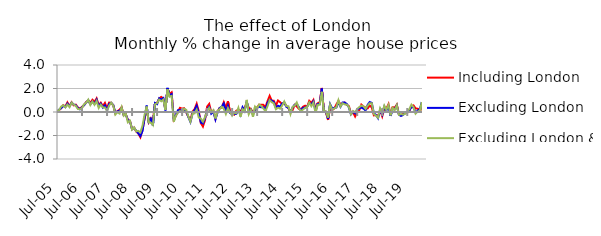
| Category | Including London | Excluding London | Excluding London & SE |
|---|---|---|---|
| 2005-07-01 | 0.014 | -0.006 | 0.09 |
| 2005-08-01 | 0.163 | 0.204 | 0.162 |
| 2005-09-01 | 0.324 | 0.325 | 0.462 |
| 2005-10-01 | 0.577 | 0.533 | 0.574 |
| 2005-11-01 | 0.466 | 0.417 | 0.391 |
| 2005-12-01 | 0.812 | 0.711 | 0.637 |
| 2006-01-01 | 0.5 | 0.49 | 0.413 |
| 2006-02-01 | 0.828 | 0.794 | 0.795 |
| 2006-03-01 | 0.563 | 0.637 | 0.633 |
| 2006-04-01 | 0.621 | 0.57 | 0.521 |
| 2006-05-01 | 0.386 | 0.352 | 0.256 |
| 2006-06-01 | 0.291 | 0.226 | 0.232 |
| 2006-07-01 | 0.438 | 0.412 | 0.342 |
| 2006-08-01 | 0.591 | 0.577 | 0.661 |
| 2006-09-01 | 0.848 | 0.81 | 0.786 |
| 2006-10-01 | 0.979 | 1.005 | 1.049 |
| 2006-11-01 | 0.775 | 0.651 | 0.593 |
| 2006-12-01 | 1.037 | 0.905 | 0.892 |
| 2007-01-01 | 0.858 | 0.697 | 0.609 |
| 2007-02-01 | 1.157 | 1.043 | 0.936 |
| 2007-03-01 | 0.591 | 0.493 | 0.34 |
| 2007-04-01 | 0.791 | 0.71 | 0.625 |
| 2007-05-01 | 0.495 | 0.385 | 0.394 |
| 2007-06-01 | 0.773 | 0.572 | 0.376 |
| 2007-07-01 | 0.314 | 0.122 | 0.088 |
| 2007-08-01 | 0.802 | 0.688 | 0.543 |
| 2007-09-01 | 0.779 | 0.781 | 0.791 |
| 2007-10-01 | 0.566 | 0.59 | 0.551 |
| 2007-11-01 | -0.121 | -0.088 | -0.213 |
| 2007-12-01 | 0.07 | 0.05 | -0.02 |
| 2008-01-01 | 0.193 | 0.09 | -0.129 |
| 2008-02-01 | 0.407 | 0.326 | 0.403 |
| 2008-03-01 | -0.27 | -0.262 | -0.309 |
| 2008-04-01 | -0.198 | -0.21 | -0.151 |
| 2008-05-01 | -0.666 | -0.685 | -0.88 |
| 2008-06-01 | -0.763 | -0.783 | -0.746 |
| 2008-07-01 | -1.456 | -1.471 | -1.501 |
| 2008-08-01 | -1.333 | -1.353 | -1.313 |
| 2008-09-01 | -1.666 | -1.602 | -1.648 |
| 2008-10-01 | -1.827 | -1.811 | -1.607 |
| 2008-11-01 | -2.152 | -2.056 | -1.731 |
| 2008-12-01 | -1.511 | -1.621 | -1.176 |
| 2009-01-01 | -0.593 | -0.517 | -0.245 |
| 2009-02-01 | 0.356 | 0.548 | 0.469 |
| 2009-03-01 | -0.862 | -0.838 | -0.892 |
| 2009-04-01 | -0.536 | -0.573 | -0.91 |
| 2009-05-01 | -0.786 | -1.169 | -1.113 |
| 2009-06-01 | 0.762 | 0.765 | 0.654 |
| 2009-07-01 | 0.77 | 0.668 | 0.757 |
| 2009-08-01 | 1.139 | 1.168 | 1.057 |
| 2009-09-01 | 1.284 | 1.066 | 0.915 |
| 2009-10-01 | 1.145 | 1.185 | 1.057 |
| 2009-11-01 | 0.204 | 0.132 | 0.175 |
| 2009-12-01 | 1.994 | 2.051 | 1.926 |
| 2010-01-01 | 1.536 | 1.399 | 1.297 |
| 2010-02-01 | 1.676 | 1.521 | 1.369 |
| 2010-03-01 | -0.651 | -0.718 | -0.827 |
| 2010-04-01 | -0.343 | -0.254 | -0.294 |
| 2010-05-01 | 0.049 | 0.144 | -0.074 |
| 2010-06-01 | 0.354 | 0.167 | 0.091 |
| 2010-07-01 | 0.283 | 0.116 | -0.045 |
| 2010-08-01 | 0.323 | 0.246 | 0.282 |
| 2010-09-01 | -0.047 | 0.051 | 0.181 |
| 2010-10-01 | -0.391 | -0.428 | -0.388 |
| 2010-11-01 | -0.701 | -0.847 | -0.825 |
| 2010-12-01 | 0.034 | -0.13 | -0.156 |
| 2011-01-01 | 0.244 | 0.162 | -0.115 |
| 2011-02-01 | 0.703 | 0.521 | 0.199 |
| 2011-03-01 | 0.059 | -0.093 | -0.469 |
| 2011-04-01 | -0.947 | -0.896 | -0.555 |
| 2011-05-01 | -1.241 | -0.98 | -0.829 |
| 2011-06-01 | -0.69 | -0.549 | -0.431 |
| 2011-07-01 | 0.458 | 0.212 | 0.054 |
| 2011-08-01 | 0.687 | 0.448 | 0.361 |
| 2011-09-01 | -0.023 | -0.142 | -0.013 |
| 2011-10-01 | 0.118 | 0.024 | 0.154 |
| 2011-11-01 | -0.58 | -0.635 | -0.549 |
| 2011-12-01 | 0.04 | -0.052 | 0.097 |
| 2012-01-01 | 0.333 | 0.333 | 0.235 |
| 2012-02-01 | 0.371 | 0.455 | 0.454 |
| 2012-03-01 | 0.836 | 0.719 | 0.266 |
| 2012-04-01 | 0.354 | 0.041 | -0.17 |
| 2012-05-01 | 0.924 | 0.531 | 0.33 |
| 2012-06-01 | -0.009 | -0.088 | -0.008 |
| 2012-07-01 | -0.101 | -0.157 | -0.313 |
| 2012-08-01 | -0.222 | -0.149 | -0.056 |
| 2012-09-01 | 0.107 | -0.167 | -0.111 |
| 2012-10-01 | 0.182 | 0.18 | 0.355 |
| 2012-11-01 | 0.049 | -0.244 | -0.405 |
| 2012-12-01 | 0.313 | 0.4 | 0.24 |
| 2013-01-01 | 0.306 | 0.087 | 0.068 |
| 2013-02-01 | 0.812 | 0.894 | 1.028 |
| 2013-03-01 | 0.345 | 0.054 | -0.185 |
| 2013-04-01 | 0.271 | 0.195 | 0.178 |
| 2013-05-01 | -0.069 | -0.184 | -0.413 |
| 2013-06-01 | 0.154 | 0.189 | 0.469 |
| 2013-07-01 | 0.387 | 0.362 | 0.318 |
| 2013-08-01 | 0.627 | 0.449 | 0.637 |
| 2013-09-01 | 0.614 | 0.397 | 0.507 |
| 2013-10-01 | 0.608 | 0.414 | 0.301 |
| 2013-11-01 | 0.433 | 0.181 | 0.067 |
| 2013-12-01 | 0.932 | 0.793 | 0.508 |
| 2014-01-01 | 1.371 | 1.039 | 1.01 |
| 2014-02-01 | 0.968 | 0.974 | 0.843 |
| 2014-03-01 | 0.953 | 0.835 | 0.729 |
| 2014-04-01 | 0.53 | 0.345 | 0.232 |
| 2014-05-01 | 0.977 | 0.529 | 0.368 |
| 2014-06-01 | 0.841 | 0.457 | 0.28 |
| 2014-07-01 | 0.675 | 0.715 | 0.55 |
| 2014-08-01 | 0.759 | 0.82 | 0.894 |
| 2014-09-01 | 0.533 | 0.443 | 0.501 |
| 2014-10-01 | 0.322 | 0.36 | 0.496 |
| 2014-11-01 | -0.008 | -0.021 | -0.17 |
| 2014-12-01 | 0.156 | 0.384 | 0.434 |
| 2015-01-01 | 0.598 | 0.617 | 0.551 |
| 2015-02-01 | 0.48 | 0.685 | 0.811 |
| 2015-03-01 | 0.272 | 0.423 | 0.331 |
| 2015-04-01 | 0.21 | 0.118 | 0.074 |
| 2015-05-01 | 0.449 | 0.351 | 0.211 |
| 2015-06-01 | 0.537 | 0.353 | 0.352 |
| 2015-07-01 | 0.463 | 0.465 | 0.426 |
| 2015-08-01 | 0.947 | 0.741 | 0.809 |
| 2015-09-01 | 0.767 | 0.655 | 0.494 |
| 2015-10-01 | 1.027 | 0.909 | 0.799 |
| 2015-11-01 | 0.191 | 0.085 | -0.057 |
| 2015-12-01 | 0.742 | 0.676 | 0.617 |
| 2016-01-01 | 0.805 | 0.681 | 0.612 |
| 2016-02-01 | 2.049 | 1.995 | 1.717 |
| 2016-03-01 | 0.139 | 0.043 | 0.039 |
| 2016-04-01 | -0.033 | 0.019 | 0.047 |
| 2016-05-01 | -0.677 | -0.587 | -0.483 |
| 2016-06-01 | 0.364 | 0.673 | 0.627 |
| 2016-07-01 | 0.169 | 0.309 | 0.195 |
| 2016-08-01 | 0.3 | 0.345 | 0.303 |
| 2016-09-01 | 0.633 | 0.377 | 0.395 |
| 2016-10-01 | 0.948 | 0.834 | 1.008 |
| 2016-11-01 | 0.616 | 0.446 | 0.473 |
| 2016-12-01 | 0.749 | 0.812 | 0.741 |
| 2017-01-01 | 0.808 | 0.802 | 0.649 |
| 2017-02-01 | 0.604 | 0.688 | 0.644 |
| 2017-03-01 | 0.501 | 0.389 | 0.426 |
| 2017-04-01 | -0.081 | -0.197 | -0.192 |
| 2017-05-01 | -0.038 | 0.018 | 0.084 |
| 2017-06-01 | -0.387 | -0.117 | -0.018 |
| 2017-07-01 | -0.049 | 0.194 | 0.262 |
| 2017-08-01 | 0.161 | 0.324 | 0.42 |
| 2017-09-01 | 0.631 | 0.378 | 0.54 |
| 2017-10-01 | 0.465 | 0.291 | 0.497 |
| 2017-11-01 | 0.38 | 0.138 | 0.262 |
| 2017-12-01 | 0.306 | 0.611 | 0.544 |
| 2018-01-01 | 0.546 | 0.845 | 0.735 |
| 2018-02-01 | 0.383 | 0.778 | 0.741 |
| 2018-03-01 | -0.286 | -0.128 | -0.179 |
| 2018-04-01 | -0.269 | -0.244 | -0.297 |
| 2018-05-01 | -0.322 | -0.529 | -0.491 |
| 2018-06-01 | 0.146 | 0.189 | 0.303 |
| 2018-07-01 | -0.37 | -0.221 | -0.081 |
| 2018-08-01 | 0.285 | 0.453 | 0.544 |
| 2018-09-01 | 0.297 | 0.134 | 0.197 |
| 2018-10-01 | 0.665 | 0.476 | 0.595 |
| 2018-11-01 | -0.272 | -0.333 | -0.287 |
| 2018-12-01 | 0.415 | 0.257 | 0.358 |
| 2019-01-01 | 0.368 | 0.257 | 0.153 |
| 2019-02-01 | 0.634 | 0.558 | 0.578 |
| 2019-03-01 | -0.196 | -0.235 | -0.242 |
| 2019-04-01 | -0.289 | -0.335 | -0.173 |
| 2019-05-01 | -0.157 | -0.253 | -0.226 |
| 2019-06-01 | -0.104 | -0.055 | -0.152 |
| 2019-07-01 | -0.07 | -0.005 | 0.028 |
| 2019-08-01 | 0.088 | 0.142 | 0.242 |
| 2019-09-01 | 0.485 | 0.417 | 0.626 |
| 2019-10-01 | 0.564 | 0.397 | 0.422 |
| 2019-11-01 | 0.307 | -0.043 | -0.142 |
| 2019-12-01 | 0.28 | 0.117 | 0.028 |
| 2020-01-01 | 0.185 | 0.239 | 0.131 |
| 2020-02-01 | 0.492 | 0.839 | 0.827 |
| 2020-03-01 | -0.49 | -0.411 | -0.75 |
| 2020-04-01 | -1.112 | -0.984 | -1.151 |